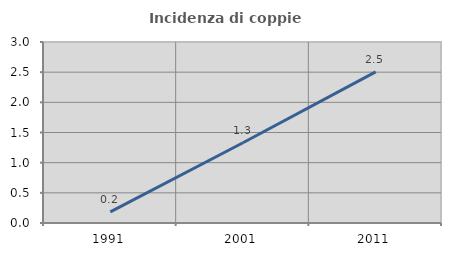
| Category | Incidenza di coppie miste |
|---|---|
| 1991.0 | 0.184 |
| 2001.0 | 1.33 |
| 2011.0 | 2.504 |